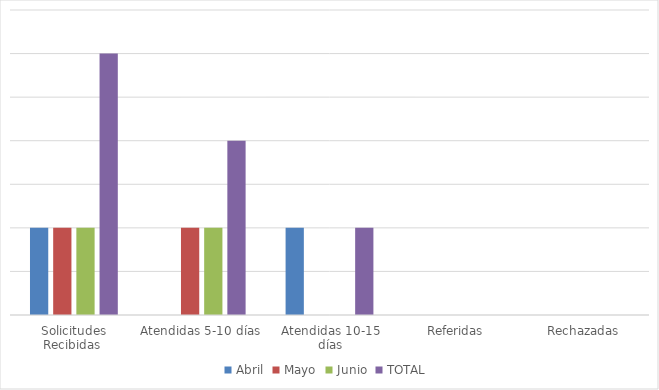
| Category | Abril | Mayo | Junio | TOTAL  |
|---|---|---|---|---|
| Solicitudes Recibidas  | 1 | 1 | 1 | 3 |
| Atendidas 5-10 días | 0 | 1 | 1 | 2 |
| Atendidas 10-15 días | 1 | 0 | 0 | 1 |
| Referidas | 0 | 0 | 0 | 0 |
| Rechazadas | 0 | 0 | 0 | 0 |